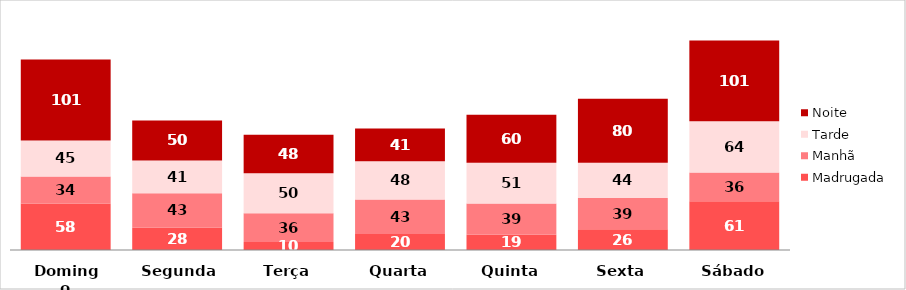
| Category | Madrugada | Manhã | Tarde | Noite |
|---|---|---|---|---|
| Domingo | 58 | 34 | 45 | 101 |
| Segunda | 28 | 43 | 41 | 50 |
| Terça | 10 | 36 | 50 | 48 |
| Quarta | 20 | 43 | 48 | 41 |
| Quinta | 19 | 39 | 51 | 60 |
| Sexta | 26 | 39 | 44 | 80 |
| Sábado | 61 | 36 | 64 | 101 |